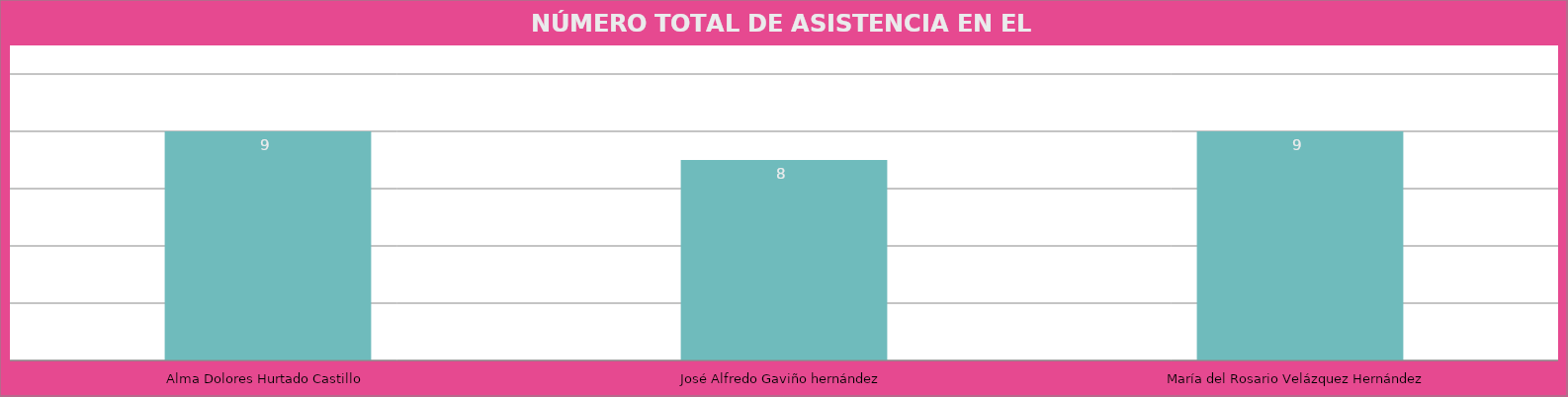
| Category | Alma Dolores Hurtado Castillo |
|---|---|
| Alma Dolores Hurtado Castillo | 9 |
| José Alfredo Gaviño hernández | 8 |
| María del Rosario Velázquez Hernández | 9 |